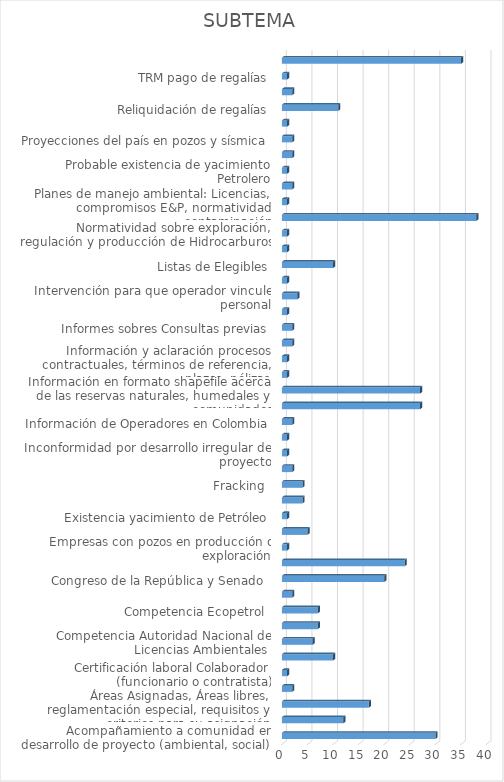
| Category | CANTIDAD |
|---|---|
| Acompañamiento a comunidad en desarrollo de proyecto (ambiental, social) | 30 |
| Actividad Hidrocarburífera en regiones del país | 12 |
| Áreas Asignadas, Áreas libres, reglamentación especial, requisitos y criterios para su asignación | 17 |
| Cartografía zonas Petrolera | 2 |
| Certificación laboral Colaborador (funcionario o contratista) | 1 |
| Cifras oficiales de producción en el país (producción, precio, demanda, Columnas Estratigráficas | 10 |
| Competencia Autoridad Nacional de Licencias Ambientales  | 6 |
| Competencia del Ministerio de Minas y Energía  | 7 |
| Competencia Ecopetrol  | 7 |
| Comportamiento del mercado de hidrocarburos en Colombia (producción y consumo interno petróleo y gas) | 2 |
| Congreso de la República y Senado  | 20 |
| Copias de contratos (E&P, TEAS y Administrativos) | 24 |
| Empresas con pozos en producción o exploración | 1 |
| Estado actual de Pozos | 5 |
| Existencia yacimiento de Petróleo | 1 |
| Fiscalización  | 4 |
| Fracking  | 4 |
| Incoder Titulación de Baldíos  | 2 |
| Inconformidad por desarrollo irregular de proyecto | 1 |
| Información con fines Académicos (tesis de pregrado y postgrado) | 1 |
| Información de Operadores en Colombia | 2 |
| Información del trámite o proceso para pago de regalías | 27 |
| Información en formato shapefile acerca de las reservas naturales, humedales y comunidades | 27 |
| Información Geológica de perforaciones | 1 |
| Información y aclaración procesos contractuales, términos de referencia, plazos, pólizas | 1 |
| Información y aclaración sobre los TEAs, E&P, Bloques | 2 |
| Informes sobres Consultas previas | 2 |
| Intervención para que compañía pague daños causados o tomar correctivos | 1 |
| Intervención para que operador vincule personal | 3 |
| Intervención por no pago a subcontratistas por parte de Operadoras  | 1 |
| Listas de Elegibles | 10 |
| No aplica | 1 |
| Normatividad sobre exploración, regulación y producción de Hidrocarburos | 1 |
| Otros | 38 |
| Planes de manejo ambiental: Licencias, compromisos E&P, normatividad contaminación | 1 |
| Posibilidades petrolifícas en Colombia | 2 |
| Probable existencia de yacimiento Petrolero | 1 |
| Proyección Exploración y Producción de Petróleo en Colombia | 2 |
| Proyecciones del país en pozos y sísmica | 2 |
| Publicaciones e Informes, Estudios: geofísicos, sísmica y estratigrafía | 1 |
| Reliquidación de regalías | 11 |
| Reservas probadas ó estimadas de Hidrocarburos en Colombia | 2 |
| TRM pago de regalías | 1 |
| (en blanco) | 35 |